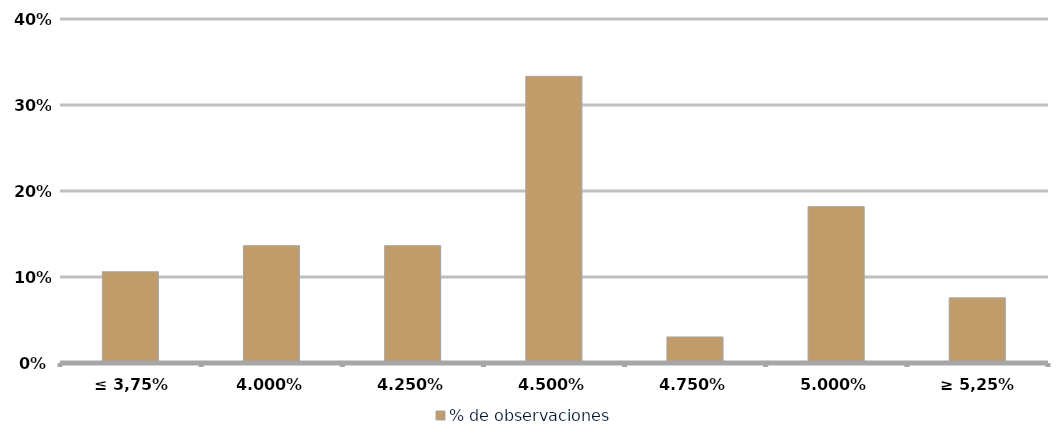
| Category | % de observaciones  |
|---|---|
| ≤ 3,75% | 0.106 |
| 4,00% | 0.136 |
| 4,25% | 0.136 |
| 4,50% | 0.333 |
| 4,75% | 0.03 |
| 5,00% | 0.182 |
| ≥ 5,25% | 0.076 |